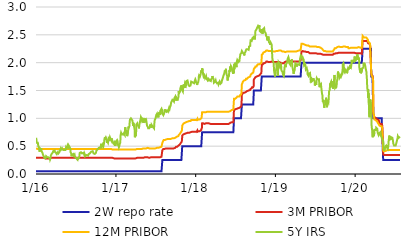
| Category | 2W repo rate | 3M PRIBOR | 12M PRIBOR | 5Y IRS |
|---|---|---|---|---|
| 2016-01-04 | 0.05 | 0.29 | 0.46 | 0.65 |
| 2016-01-05 | 0.05 | 0.29 | 0.46 | 0.63 |
| 2016-01-06 | 0.05 | 0.29 | 0.46 | 0.62 |
| 2016-01-07 | 0.05 | 0.29 | 0.46 | 0.56 |
| 2016-01-08 | 0.05 | 0.29 | 0.46 | 0.57 |
| 2016-01-11 | 0.05 | 0.29 | 0.45 | 0.56 |
| 2016-01-12 | 0.05 | 0.29 | 0.45 | 0.56 |
| 2016-01-13 | 0.05 | 0.29 | 0.45 | 0.56 |
| 2016-01-14 | 0.05 | 0.29 | 0.45 | 0.5 |
| 2016-01-15 | 0.05 | 0.29 | 0.45 | 0.49 |
| 2016-01-18 | 0.05 | 0.29 | 0.45 | 0.46 |
| 2016-01-19 | 0.05 | 0.29 | 0.45 | 0.46 |
| 2016-01-20 | 0.05 | 0.29 | 0.45 | 0.4 |
| 2016-01-21 | 0.05 | 0.29 | 0.45 | 0.43 |
| 2016-01-22 | 0.05 | 0.29 | 0.45 | 0.46 |
| 2016-01-25 | 0.05 | 0.29 | 0.45 | 0.45 |
| 2016-01-26 | 0.05 | 0.29 | 0.45 | 0.44 |
| 2016-01-27 | 0.05 | 0.29 | 0.45 | 0.46 |
| 2016-01-28 | 0.05 | 0.29 | 0.45 | 0.44 |
| 2016-01-29 | 0.05 | 0.29 | 0.45 | 0.41 |
| 2016-02-01 | 0.05 | 0.29 | 0.45 | 0.4 |
| 2016-02-02 | 0.05 | 0.29 | 0.45 | 0.38 |
| 2016-02-03 | 0.05 | 0.29 | 0.45 | 0.37 |
| 2016-02-04 | 0.05 | 0.29 | 0.45 | 0.37 |
| 2016-02-05 | 0.05 | 0.29 | 0.45 | 0.34 |
| 2016-02-08 | 0.05 | 0.29 | 0.45 | 0.32 |
| 2016-02-09 | 0.05 | 0.28 | 0.45 | 0.31 |
| 2016-02-10 | 0.05 | 0.28 | 0.45 | 0.31 |
| 2016-02-11 | 0.05 | 0.28 | 0.45 | 0.29 |
| 2016-02-12 | 0.05 | 0.28 | 0.45 | 0.28 |
| 2016-02-15 | 0.05 | 0.28 | 0.45 | 0.28 |
| 2016-02-16 | 0.05 | 0.28 | 0.45 | 0.28 |
| 2016-02-17 | 0.05 | 0.28 | 0.45 | 0.28 |
| 2016-02-18 | 0.05 | 0.28 | 0.45 | 0.3 |
| 2016-02-19 | 0.05 | 0.28 | 0.45 | 0.32 |
| 2016-02-22 | 0.05 | 0.28 | 0.45 | 0.32 |
| 2016-02-23 | 0.05 | 0.28 | 0.45 | 0.32 |
| 2016-02-24 | 0.05 | 0.28 | 0.45 | 0.3 |
| 2016-02-25 | 0.05 | 0.28 | 0.45 | 0.3 |
| 2016-02-26 | 0.05 | 0.28 | 0.45 | 0.31 |
| 2016-02-29 | 0.05 | 0.28 | 0.45 | 0.3 |
| 2016-03-01 | 0.05 | 0.28 | 0.45 | 0.29 |
| 2016-03-02 | 0.05 | 0.28 | 0.45 | 0.31 |
| 2016-03-03 | 0.05 | 0.28 | 0.45 | 0.3 |
| 2016-03-04 | 0.05 | 0.28 | 0.45 | 0.29 |
| 2016-03-07 | 0.05 | 0.28 | 0.45 | 0.28 |
| 2016-03-08 | 0.05 | 0.28 | 0.45 | 0.26 |
| 2016-03-09 | 0.05 | 0.28 | 0.45 | 0.26 |
| 2016-03-10 | 0.05 | 0.28 | 0.45 | 0.28 |
| 2016-03-11 | 0.05 | 0.29 | 0.45 | 0.33 |
| 2016-03-14 | 0.05 | 0.29 | 0.45 | 0.34 |
| 2016-03-15 | 0.05 | 0.29 | 0.45 | 0.36 |
| 2016-03-16 | 0.05 | 0.29 | 0.45 | 0.37 |
| 2016-03-17 | 0.05 | 0.29 | 0.45 | 0.37 |
| 2016-03-18 | 0.05 | 0.29 | 0.45 | 0.37 |
| 2016-03-21 | 0.05 | 0.29 | 0.45 | 0.39 |
| 2016-03-22 | 0.05 | 0.29 | 0.45 | 0.41 |
| 2016-03-23 | 0.05 | 0.29 | 0.45 | 0.41 |
| 2016-03-24 | 0.05 | 0.29 | 0.45 | 0.4 |
| 2016-03-29 | 0.05 | 0.29 | 0.45 | 0.42 |
| 2016-03-30 | 0.05 | 0.29 | 0.45 | 0.4 |
| 2016-03-31 | 0.05 | 0.29 | 0.45 | 0.4 |
| 2016-04-01 | 0.05 | 0.29 | 0.45 | 0.4 |
| 2016-04-04 | 0.05 | 0.29 | 0.45 | 0.38 |
| 2016-04-05 | 0.05 | 0.29 | 0.45 | 0.37 |
| 2016-04-06 | 0.05 | 0.29 | 0.45 | 0.38 |
| 2016-04-07 | 0.05 | 0.29 | 0.45 | 0.36 |
| 2016-04-08 | 0.05 | 0.29 | 0.45 | 0.36 |
| 2016-04-11 | 0.05 | 0.29 | 0.45 | 0.35 |
| 2016-04-12 | 0.05 | 0.29 | 0.45 | 0.39 |
| 2016-04-13 | 0.05 | 0.29 | 0.45 | 0.37 |
| 2016-04-14 | 0.05 | 0.29 | 0.45 | 0.39 |
| 2016-04-15 | 0.05 | 0.29 | 0.45 | 0.37 |
| 2016-04-18 | 0.05 | 0.29 | 0.45 | 0.37 |
| 2016-04-19 | 0.05 | 0.29 | 0.45 | 0.39 |
| 2016-04-20 | 0.05 | 0.29 | 0.45 | 0.38 |
| 2016-04-21 | 0.05 | 0.29 | 0.45 | 0.41 |
| 2016-04-22 | 0.05 | 0.29 | 0.45 | 0.41 |
| 2016-04-25 | 0.05 | 0.29 | 0.45 | 0.42 |
| 2016-04-26 | 0.05 | 0.29 | 0.45 | 0.46 |
| 2016-04-27 | 0.05 | 0.29 | 0.45 | 0.46 |
| 2016-04-28 | 0.05 | 0.29 | 0.45 | 0.44 |
| 2016-04-29 | 0.05 | 0.29 | 0.45 | 0.45 |
| 2016-05-02 | 0.05 | 0.29 | 0.45 | 0.46 |
| 2016-05-03 | 0.05 | 0.29 | 0.45 | 0.46 |
| 2016-05-04 | 0.05 | 0.29 | 0.45 | 0.44 |
| 2016-05-05 | 0.05 | 0.29 | 0.45 | 0.45 |
| 2016-05-06 | 0.05 | 0.29 | 0.45 | 0.44 |
| 2016-05-09 | 0.05 | 0.29 | 0.45 | 0.43 |
| 2016-05-10 | 0.05 | 0.29 | 0.45 | 0.44 |
| 2016-05-11 | 0.05 | 0.29 | 0.45 | 0.43 |
| 2016-05-12 | 0.05 | 0.29 | 0.45 | 0.42 |
| 2016-05-13 | 0.05 | 0.29 | 0.45 | 0.43 |
| 2016-05-16 | 0.05 | 0.29 | 0.45 | 0.43 |
| 2016-05-17 | 0.05 | 0.29 | 0.45 | 0.44 |
| 2016-05-18 | 0.05 | 0.29 | 0.45 | 0.44 |
| 2016-05-19 | 0.05 | 0.29 | 0.45 | 0.46 |
| 2016-05-20 | 0.05 | 0.29 | 0.45 | 0.48 |
| 2016-05-23 | 0.05 | 0.29 | 0.45 | 0.46 |
| 2016-05-24 | 0.05 | 0.29 | 0.45 | 0.46 |
| 2016-05-25 | 0.05 | 0.29 | 0.45 | 0.48 |
| 2016-05-26 | 0.05 | 0.29 | 0.45 | 0.48 |
| 2016-05-27 | 0.05 | 0.29 | 0.45 | 0.51 |
| 2016-05-30 | 0.05 | 0.29 | 0.45 | 0.49 |
| 2016-05-31 | 0.05 | 0.29 | 0.45 | 0.52 |
| 2016-06-01 | 0.05 | 0.29 | 0.45 | 0.51 |
| 2016-06-02 | 0.05 | 0.29 | 0.45 | 0.51 |
| 2016-06-03 | 0.05 | 0.29 | 0.45 | 0.51 |
| 2016-06-06 | 0.05 | 0.29 | 0.45 | 0.48 |
| 2016-06-07 | 0.05 | 0.29 | 0.45 | 0.49 |
| 2016-06-08 | 0.05 | 0.29 | 0.45 | 0.47 |
| 2016-06-09 | 0.05 | 0.29 | 0.45 | 0.45 |
| 2016-06-10 | 0.05 | 0.29 | 0.45 | 0.39 |
| 2016-06-13 | 0.05 | 0.29 | 0.45 | 0.37 |
| 2016-06-14 | 0.05 | 0.29 | 0.45 | 0.32 |
| 2016-06-15 | 0.05 | 0.29 | 0.45 | 0.32 |
| 2016-06-16 | 0.05 | 0.29 | 0.45 | 0.32 |
| 2016-06-17 | 0.05 | 0.29 | 0.45 | 0.35 |
| 2016-06-20 | 0.05 | 0.29 | 0.45 | 0.35 |
| 2016-06-21 | 0.05 | 0.29 | 0.45 | 0.36 |
| 2016-06-22 | 0.05 | 0.29 | 0.45 | 0.36 |
| 2016-06-23 | 0.05 | 0.29 | 0.45 | 0.36 |
| 2016-06-24 | 0.05 | 0.29 | 0.45 | 0.33 |
| 2016-06-27 | 0.05 | 0.29 | 0.45 | 0.32 |
| 2016-06-28 | 0.05 | 0.29 | 0.45 | 0.35 |
| 2016-06-29 | 0.05 | 0.29 | 0.45 | 0.33 |
| 2016-06-30 | 0.05 | 0.29 | 0.45 | 0.31 |
| 2016-07-01 | 0.05 | 0.29 | 0.45 | 0.31 |
| 2016-07-04 | 0.05 | 0.29 | 0.45 | 0.29 |
| 2016-07-07 | 0.05 | 0.29 | 0.45 | 0.28 |
| 2016-07-08 | 0.05 | 0.29 | 0.45 | 0.28 |
| 2016-07-11 | 0.05 | 0.29 | 0.45 | 0.26 |
| 2016-07-12 | 0.05 | 0.29 | 0.45 | 0.3 |
| 2016-07-13 | 0.05 | 0.29 | 0.45 | 0.29 |
| 2016-07-14 | 0.05 | 0.29 | 0.45 | 0.27 |
| 2016-07-15 | 0.05 | 0.29 | 0.45 | 0.28 |
| 2016-07-18 | 0.05 | 0.29 | 0.45 | 0.29 |
| 2016-07-19 | 0.05 | 0.29 | 0.45 | 0.28 |
| 2016-07-20 | 0.05 | 0.29 | 0.45 | 0.32 |
| 2016-07-21 | 0.05 | 0.29 | 0.45 | 0.36 |
| 2016-07-22 | 0.05 | 0.29 | 0.45 | 0.38 |
| 2016-07-25 | 0.05 | 0.29 | 0.45 | 0.38 |
| 2016-07-26 | 0.05 | 0.29 | 0.45 | 0.38 |
| 2016-07-27 | 0.05 | 0.29 | 0.45 | 0.39 |
| 2016-07-28 | 0.05 | 0.29 | 0.45 | 0.38 |
| 2016-07-29 | 0.05 | 0.29 | 0.45 | 0.38 |
| 2016-08-01 | 0.05 | 0.29 | 0.45 | 0.37 |
| 2016-08-02 | 0.05 | 0.29 | 0.45 | 0.37 |
| 2016-08-03 | 0.05 | 0.29 | 0.45 | 0.37 |
| 2016-08-04 | 0.05 | 0.29 | 0.45 | 0.38 |
| 2016-08-05 | 0.05 | 0.29 | 0.45 | 0.38 |
| 2016-08-08 | 0.05 | 0.29 | 0.45 | 0.38 |
| 2016-08-09 | 0.05 | 0.29 | 0.45 | 0.37 |
| 2016-08-10 | 0.05 | 0.29 | 0.45 | 0.37 |
| 2016-08-11 | 0.05 | 0.29 | 0.45 | 0.35 |
| 2016-08-12 | 0.05 | 0.29 | 0.45 | 0.37 |
| 2016-08-15 | 0.05 | 0.29 | 0.45 | 0.34 |
| 2016-08-16 | 0.05 | 0.29 | 0.45 | 0.32 |
| 2016-08-17 | 0.05 | 0.29 | 0.45 | 0.33 |
| 2016-08-18 | 0.05 | 0.29 | 0.45 | 0.33 |
| 2016-08-19 | 0.05 | 0.29 | 0.45 | 0.33 |
| 2016-08-22 | 0.05 | 0.29 | 0.45 | 0.34 |
| 2016-08-23 | 0.05 | 0.29 | 0.45 | 0.33 |
| 2016-08-24 | 0.05 | 0.29 | 0.45 | 0.33 |
| 2016-08-25 | 0.05 | 0.29 | 0.45 | 0.33 |
| 2016-08-26 | 0.05 | 0.29 | 0.45 | 0.33 |
| 2016-08-29 | 0.05 | 0.29 | 0.45 | 0.33 |
| 2016-08-30 | 0.05 | 0.29 | 0.45 | 0.33 |
| 2016-08-31 | 0.05 | 0.29 | 0.45 | 0.34 |
| 2016-09-01 | 0.05 | 0.29 | 0.45 | 0.36 |
| 2016-09-02 | 0.05 | 0.29 | 0.45 | 0.36 |
| 2016-09-05 | 0.05 | 0.29 | 0.45 | 0.37 |
| 2016-09-06 | 0.05 | 0.29 | 0.45 | 0.37 |
| 2016-09-07 | 0.05 | 0.29 | 0.45 | 0.36 |
| 2016-09-08 | 0.05 | 0.29 | 0.45 | 0.36 |
| 2016-09-09 | 0.05 | 0.29 | 0.45 | 0.38 |
| 2016-09-12 | 0.05 | 0.29 | 0.45 | 0.4 |
| 2016-09-13 | 0.05 | 0.29 | 0.45 | 0.4 |
| 2016-09-14 | 0.05 | 0.29 | 0.45 | 0.4 |
| 2016-09-15 | 0.05 | 0.29 | 0.45 | 0.41 |
| 2016-09-16 | 0.05 | 0.29 | 0.45 | 0.41 |
| 2016-09-19 | 0.05 | 0.29 | 0.45 | 0.41 |
| 2016-09-20 | 0.05 | 0.29 | 0.45 | 0.41 |
| 2016-09-21 | 0.05 | 0.29 | 0.45 | 0.39 |
| 2016-09-22 | 0.05 | 0.29 | 0.45 | 0.38 |
| 2016-09-23 | 0.05 | 0.29 | 0.45 | 0.37 |
| 2016-09-26 | 0.05 | 0.29 | 0.45 | 0.36 |
| 2016-09-27 | 0.05 | 0.29 | 0.45 | 0.36 |
| 2016-09-29 | 0.05 | 0.29 | 0.45 | 0.36 |
| 2016-09-30 | 0.05 | 0.29 | 0.45 | 0.36 |
| 2016-10-03 | 0.05 | 0.29 | 0.45 | 0.37 |
| 2016-10-04 | 0.05 | 0.29 | 0.45 | 0.38 |
| 2016-10-05 | 0.05 | 0.29 | 0.45 | 0.39 |
| 2016-10-06 | 0.05 | 0.29 | 0.45 | 0.42 |
| 2016-10-07 | 0.05 | 0.29 | 0.45 | 0.42 |
| 2016-10-10 | 0.05 | 0.29 | 0.45 | 0.43 |
| 2016-10-11 | 0.05 | 0.29 | 0.45 | 0.44 |
| 2016-10-12 | 0.05 | 0.29 | 0.45 | 0.44 |
| 2016-10-13 | 0.05 | 0.29 | 0.45 | 0.45 |
| 2016-10-14 | 0.05 | 0.29 | 0.45 | 0.45 |
| 2016-10-17 | 0.05 | 0.29 | 0.45 | 0.47 |
| 2016-10-18 | 0.05 | 0.29 | 0.45 | 0.47 |
| 2016-10-19 | 0.05 | 0.29 | 0.45 | 0.47 |
| 2016-10-20 | 0.05 | 0.29 | 0.45 | 0.48 |
| 2016-10-21 | 0.05 | 0.29 | 0.45 | 0.48 |
| 2016-10-24 | 0.05 | 0.29 | 0.45 | 0.48 |
| 2016-10-25 | 0.05 | 0.29 | 0.45 | 0.46 |
| 2016-10-26 | 0.05 | 0.29 | 0.45 | 0.48 |
| 2016-10-27 | 0.05 | 0.29 | 0.45 | 0.53 |
| 2016-10-31 | 0.05 | 0.29 | 0.45 | 0.54 |
| 2016-11-01 | 0.05 | 0.29 | 0.45 | 0.53 |
| 2016-11-02 | 0.05 | 0.29 | 0.45 | 0.51 |
| 2016-11-03 | 0.05 | 0.29 | 0.45 | 0.52 |
| 2016-11-04 | 0.05 | 0.29 | 0.45 | 0.53 |
| 2016-11-07 | 0.05 | 0.29 | 0.45 | 0.5 |
| 2016-11-08 | 0.05 | 0.29 | 0.45 | 0.49 |
| 2016-11-09 | 0.05 | 0.29 | 0.45 | 0.51 |
| 2016-11-10 | 0.05 | 0.29 | 0.45 | 0.55 |
| 2016-11-11 | 0.05 | 0.29 | 0.45 | 0.61 |
| 2016-11-14 | 0.05 | 0.29 | 0.45 | 0.66 |
| 2016-11-15 | 0.05 | 0.29 | 0.45 | 0.64 |
| 2016-11-16 | 0.05 | 0.29 | 0.45 | 0.65 |
| 2016-11-18 | 0.05 | 0.29 | 0.45 | 0.66 |
| 2016-11-21 | 0.05 | 0.29 | 0.45 | 0.63 |
| 2016-11-22 | 0.05 | 0.29 | 0.45 | 0.6 |
| 2016-11-23 | 0.05 | 0.29 | 0.45 | 0.56 |
| 2016-11-24 | 0.05 | 0.29 | 0.45 | 0.59 |
| 2016-11-25 | 0.05 | 0.29 | 0.45 | 0.59 |
| 2016-11-28 | 0.05 | 0.29 | 0.45 | 0.56 |
| 2016-11-29 | 0.05 | 0.29 | 0.45 | 0.56 |
| 2016-11-30 | 0.05 | 0.29 | 0.45 | 0.57 |
| 2016-12-01 | 0.05 | 0.29 | 0.45 | 0.64 |
| 2016-12-02 | 0.05 | 0.29 | 0.45 | 0.63 |
| 2016-12-05 | 0.05 | 0.29 | 0.45 | 0.62 |
| 2016-12-06 | 0.05 | 0.29 | 0.45 | 0.64 |
| 2016-12-07 | 0.05 | 0.29 | 0.45 | 0.66 |
| 2016-12-08 | 0.05 | 0.29 | 0.45 | 0.66 |
| 2016-12-09 | 0.05 | 0.29 | 0.45 | 0.64 |
| 2016-12-12 | 0.05 | 0.29 | 0.45 | 0.65 |
| 2016-12-13 | 0.05 | 0.29 | 0.45 | 0.63 |
| 2016-12-14 | 0.05 | 0.29 | 0.45 | 0.6 |
| 2016-12-15 | 0.05 | 0.29 | 0.45 | 0.64 |
| 2016-12-16 | 0.05 | 0.29 | 0.45 | 0.62 |
| 2016-12-19 | 0.05 | 0.29 | 0.44 | 0.59 |
| 2016-12-20 | 0.05 | 0.29 | 0.44 | 0.57 |
| 2016-12-21 | 0.05 | 0.29 | 0.44 | 0.56 |
| 2016-12-22 | 0.05 | 0.28 | 0.44 | 0.57 |
| 2016-12-23 | 0.05 | 0.28 | 0.44 | 0.55 |
| 2016-12-27 | 0.05 | 0.28 | 0.44 | 0.57 |
| 2016-12-28 | 0.05 | 0.27 | 0.43 | 0.54 |
| 2016-12-29 | 0.05 | 0.28 | 0.44 | 0.52 |
| 2016-12-30 | 0.05 | 0.28 | 0.44 | 0.52 |
| 2017-01-02 | 0.05 | 0.28 | 0.44 | 0.52 |
| 2017-01-03 | 0.05 | 0.28 | 0.44 | 0.52 |
| 2017-01-04 | 0.05 | 0.28 | 0.44 | 0.57 |
| 2017-01-05 | 0.05 | 0.28 | 0.44 | 0.59 |
| 2017-01-06 | 0.05 | 0.28 | 0.44 | 0.58 |
| 2017-01-09 | 0.05 | 0.28 | 0.44 | 0.61 |
| 2017-01-10 | 0.05 | 0.28 | 0.44 | 0.6 |
| 2017-01-11 | 0.05 | 0.28 | 0.44 | 0.59 |
| 2017-01-12 | 0.05 | 0.28 | 0.44 | 0.56 |
| 2017-01-13 | 0.05 | 0.28 | 0.44 | 0.52 |
| 2017-01-16 | 0.05 | 0.28 | 0.44 | 0.5 |
| 2017-01-17 | 0.05 | 0.28 | 0.44 | 0.48 |
| 2017-01-18 | 0.05 | 0.28 | 0.44 | 0.48 |
| 2017-01-19 | 0.05 | 0.28 | 0.44 | 0.5 |
| 2017-01-20 | 0.05 | 0.28 | 0.44 | 0.53 |
| 2017-01-23 | 0.05 | 0.28 | 0.44 | 0.56 |
| 2017-01-24 | 0.05 | 0.28 | 0.44 | 0.62 |
| 2017-01-25 | 0.05 | 0.28 | 0.44 | 0.7 |
| 2017-01-26 | 0.05 | 0.28 | 0.44 | 0.7 |
| 2017-01-27 | 0.05 | 0.28 | 0.44 | 0.74 |
| 2017-01-30 | 0.05 | 0.28 | 0.44 | 0.71 |
| 2017-01-31 | 0.05 | 0.28 | 0.44 | 0.71 |
| 2017-02-01 | 0.05 | 0.28 | 0.44 | 0.7 |
| 2017-02-02 | 0.05 | 0.28 | 0.44 | 0.72 |
| 2017-02-03 | 0.05 | 0.28 | 0.44 | 0.71 |
| 2017-02-06 | 0.05 | 0.28 | 0.44 | 0.71 |
| 2017-02-07 | 0.05 | 0.28 | 0.44 | 0.74 |
| 2017-02-08 | 0.05 | 0.28 | 0.44 | 0.75 |
| 2017-02-09 | 0.05 | 0.28 | 0.44 | 0.7 |
| 2017-02-10 | 0.05 | 0.28 | 0.44 | 0.72 |
| 2017-02-13 | 0.05 | 0.28 | 0.44 | 0.7 |
| 2017-02-14 | 0.05 | 0.28 | 0.44 | 0.77 |
| 2017-02-15 | 0.05 | 0.28 | 0.44 | 0.84 |
| 2017-02-16 | 0.05 | 0.28 | 0.44 | 0.83 |
| 2017-02-17 | 0.05 | 0.28 | 0.44 | 0.76 |
| 2017-02-20 | 0.05 | 0.28 | 0.44 | 0.79 |
| 2017-02-21 | 0.05 | 0.28 | 0.44 | 0.8 |
| 2017-02-22 | 0.05 | 0.28 | 0.44 | 0.78 |
| 2017-02-23 | 0.05 | 0.28 | 0.44 | 0.7 |
| 2017-02-24 | 0.05 | 0.28 | 0.44 | 0.68 |
| 2017-02-27 | 0.05 | 0.28 | 0.44 | 0.68 |
| 2017-02-28 | 0.05 | 0.28 | 0.44 | 0.77 |
| 2017-03-01 | 0.05 | 0.28 | 0.44 | 0.77 |
| 2017-03-02 | 0.05 | 0.28 | 0.44 | 0.85 |
| 2017-03-03 | 0.05 | 0.28 | 0.44 | 0.83 |
| 2017-03-06 | 0.05 | 0.28 | 0.44 | 0.86 |
| 2017-03-07 | 0.05 | 0.28 | 0.44 | 0.87 |
| 2017-03-08 | 0.05 | 0.28 | 0.44 | 0.96 |
| 2017-03-09 | 0.05 | 0.28 | 0.44 | 0.98 |
| 2017-03-10 | 0.05 | 0.28 | 0.44 | 0.99 |
| 2017-03-13 | 0.05 | 0.28 | 0.44 | 1 |
| 2017-03-14 | 0.05 | 0.28 | 0.44 | 1 |
| 2017-03-15 | 0.05 | 0.28 | 0.44 | 0.99 |
| 2017-03-16 | 0.05 | 0.28 | 0.44 | 0.99 |
| 2017-03-17 | 0.05 | 0.28 | 0.44 | 0.99 |
| 2017-03-20 | 0.05 | 0.28 | 0.44 | 0.96 |
| 2017-03-21 | 0.05 | 0.28 | 0.44 | 0.97 |
| 2017-03-22 | 0.05 | 0.28 | 0.44 | 0.9 |
| 2017-03-23 | 0.05 | 0.28 | 0.44 | 0.87 |
| 2017-03-24 | 0.05 | 0.28 | 0.44 | 0.92 |
| 2017-03-27 | 0.05 | 0.28 | 0.44 | 0.86 |
| 2017-03-28 | 0.05 | 0.28 | 0.44 | 0.84 |
| 2017-03-29 | 0.05 | 0.28 | 0.44 | 0.84 |
| 2017-03-30 | 0.05 | 0.28 | 0.44 | 0.8 |
| 2017-03-31 | 0.05 | 0.28 | 0.44 | 0.66 |
| 2017-04-03 | 0.05 | 0.28 | 0.44 | 0.71 |
| 2017-04-04 | 0.05 | 0.28 | 0.44 | 0.68 |
| 2017-04-05 | 0.05 | 0.28 | 0.44 | 0.73 |
| 2017-04-06 | 0.05 | 0.28 | 0.44 | 0.76 |
| 2017-04-07 | 0.05 | 0.29 | 0.44 | 0.89 |
| 2017-04-10 | 0.05 | 0.29 | 0.45 | 0.89 |
| 2017-04-11 | 0.05 | 0.29 | 0.45 | 0.91 |
| 2017-04-12 | 0.05 | 0.29 | 0.45 | 0.89 |
| 2017-04-13 | 0.05 | 0.29 | 0.45 | 0.88 |
| 2017-04-18 | 0.05 | 0.29 | 0.45 | 0.85 |
| 2017-04-19 | 0.05 | 0.29 | 0.45 | 0.82 |
| 2017-04-20 | 0.05 | 0.29 | 0.45 | 0.87 |
| 2017-04-21 | 0.05 | 0.29 | 0.45 | 0.88 |
| 2017-04-24 | 0.05 | 0.29 | 0.45 | 0.95 |
| 2017-04-25 | 0.05 | 0.29 | 0.45 | 0.93 |
| 2017-04-26 | 0.05 | 0.29 | 0.45 | 0.94 |
| 2017-04-27 | 0.05 | 0.29 | 0.45 | 0.99 |
| 2017-04-28 | 0.05 | 0.29 | 0.45 | 1.02 |
| 2017-05-02 | 0.05 | 0.29 | 0.45 | 1.02 |
| 2017-05-03 | 0.05 | 0.29 | 0.45 | 0.98 |
| 2017-05-04 | 0.05 | 0.29 | 0.45 | 1.01 |
| 2017-05-05 | 0.05 | 0.29 | 0.45 | 0.95 |
| 2017-05-09 | 0.05 | 0.29 | 0.46 | 0.97 |
| 2017-05-10 | 0.05 | 0.29 | 0.46 | 0.92 |
| 2017-05-11 | 0.05 | 0.3 | 0.46 | 0.94 |
| 2017-05-12 | 0.05 | 0.3 | 0.46 | 0.96 |
| 2017-05-15 | 0.05 | 0.3 | 0.46 | 0.96 |
| 2017-05-16 | 0.05 | 0.3 | 0.46 | 1 |
| 2017-05-17 | 0.05 | 0.3 | 0.46 | 0.97 |
| 2017-05-18 | 0.05 | 0.3 | 0.46 | 0.95 |
| 2017-05-19 | 0.05 | 0.3 | 0.46 | 0.96 |
| 2017-05-22 | 0.05 | 0.3 | 0.46 | 0.97 |
| 2017-05-23 | 0.05 | 0.3 | 0.46 | 0.94 |
| 2017-05-24 | 0.05 | 0.3 | 0.47 | 0.92 |
| 2017-05-25 | 0.05 | 0.3 | 0.47 | 0.89 |
| 2017-05-26 | 0.05 | 0.3 | 0.47 | 0.87 |
| 2017-05-29 | 0.05 | 0.3 | 0.47 | 0.87 |
| 2017-05-30 | 0.05 | 0.3 | 0.46 | 0.84 |
| 2017-05-31 | 0.05 | 0.3 | 0.46 | 0.82 |
| 2017-06-01 | 0.05 | 0.3 | 0.46 | 0.81 |
| 2017-06-02 | 0.05 | 0.29 | 0.46 | 0.81 |
| 2017-06-05 | 0.05 | 0.29 | 0.46 | 0.82 |
| 2017-06-06 | 0.05 | 0.29 | 0.46 | 0.82 |
| 2017-06-07 | 0.05 | 0.29 | 0.46 | 0.81 |
| 2017-06-08 | 0.05 | 0.29 | 0.46 | 0.85 |
| 2017-06-09 | 0.05 | 0.3 | 0.46 | 0.89 |
| 2017-06-12 | 0.05 | 0.3 | 0.46 | 0.86 |
| 2017-06-13 | 0.05 | 0.3 | 0.46 | 0.87 |
| 2017-06-14 | 0.05 | 0.3 | 0.46 | 0.87 |
| 2017-06-15 | 0.05 | 0.3 | 0.46 | 0.83 |
| 2017-06-16 | 0.05 | 0.3 | 0.46 | 0.88 |
| 2017-06-19 | 0.05 | 0.3 | 0.46 | 0.86 |
| 2017-06-20 | 0.05 | 0.3 | 0.46 | 0.86 |
| 2017-06-21 | 0.05 | 0.3 | 0.46 | 0.86 |
| 2017-06-22 | 0.05 | 0.3 | 0.46 | 0.86 |
| 2017-06-23 | 0.05 | 0.3 | 0.46 | 0.84 |
| 2017-06-26 | 0.05 | 0.3 | 0.46 | 0.83 |
| 2017-06-27 | 0.05 | 0.3 | 0.46 | 0.82 |
| 2017-06-28 | 0.05 | 0.3 | 0.46 | 0.89 |
| 2017-06-29 | 0.05 | 0.29 | 0.46 | 0.94 |
| 2017-06-30 | 0.05 | 0.3 | 0.46 | 0.97 |
| 2017-07-03 | 0.05 | 0.3 | 0.46 | 0.99 |
| 2017-07-04 | 0.05 | 0.3 | 0.46 | 0.98 |
| 2017-07-07 | 0.05 | 0.3 | 0.47 | 1.06 |
| 2017-07-10 | 0.05 | 0.3 | 0.47 | 1.08 |
| 2017-07-11 | 0.05 | 0.3 | 0.47 | 1.05 |
| 2017-07-12 | 0.05 | 0.3 | 0.47 | 1.05 |
| 2017-07-13 | 0.05 | 0.3 | 0.47 | 1.03 |
| 2017-07-14 | 0.05 | 0.3 | 0.47 | 1.03 |
| 2017-07-17 | 0.05 | 0.3 | 0.47 | 1.03 |
| 2017-07-18 | 0.05 | 0.3 | 0.47 | 1.03 |
| 2017-07-19 | 0.05 | 0.3 | 0.47 | 1.09 |
| 2017-07-20 | 0.05 | 0.3 | 0.48 | 1.1 |
| 2017-07-21 | 0.05 | 0.3 | 0.48 | 1.08 |
| 2017-07-24 | 0.05 | 0.3 | 0.48 | 1.08 |
| 2017-07-25 | 0.05 | 0.3 | 0.48 | 1.13 |
| 2017-07-26 | 0.05 | 0.3 | 0.48 | 1.14 |
| 2017-07-27 | 0.05 | 0.3 | 0.48 | 1.14 |
| 2017-07-28 | 0.05 | 0.31 | 0.48 | 1.15 |
| 2017-07-31 | 0.05 | 0.31 | 0.49 | 1.17 |
| 2017-08-01 | 0.05 | 0.31 | 0.49 | 1.18 |
| 2017-08-02 | 0.05 | 0.31 | 0.49 | 1.14 |
| 2017-08-03 | 0.05 | 0.31 | 0.49 | 1.16 |
| 2017-08-04 | 0.25 | 0.43 | 0.56 | 1.08 |
| 2017-08-07 | 0.25 | 0.44 | 0.59 | 1.07 |
| 2017-08-08 | 0.25 | 0.44 | 0.6 | 1.06 |
| 2017-08-09 | 0.25 | 0.45 | 0.6 | 1.09 |
| 2017-08-10 | 0.25 | 0.45 | 0.61 | 1.07 |
| 2017-08-11 | 0.25 | 0.45 | 0.61 | 1.09 |
| 2017-08-14 | 0.25 | 0.45 | 0.61 | 1.11 |
| 2017-08-15 | 0.25 | 0.45 | 0.61 | 1.11 |
| 2017-08-16 | 0.25 | 0.45 | 0.62 | 1.16 |
| 2017-08-17 | 0.25 | 0.46 | 0.62 | 1.14 |
| 2017-08-18 | 0.25 | 0.46 | 0.62 | 1.14 |
| 2017-08-21 | 0.25 | 0.46 | 0.62 | 1.14 |
| 2017-08-22 | 0.25 | 0.46 | 0.63 | 1.12 |
| 2017-08-23 | 0.25 | 0.46 | 0.63 | 1.13 |
| 2017-08-24 | 0.25 | 0.46 | 0.63 | 1.13 |
| 2017-08-25 | 0.25 | 0.46 | 0.63 | 1.14 |
| 2017-08-28 | 0.25 | 0.46 | 0.63 | 1.14 |
| 2017-08-29 | 0.25 | 0.46 | 0.63 | 1.14 |
| 2017-08-30 | 0.25 | 0.46 | 0.63 | 1.12 |
| 2017-08-31 | 0.25 | 0.46 | 0.63 | 1.14 |
| 2017-09-01 | 0.25 | 0.46 | 0.63 | 1.15 |
| 2017-09-04 | 0.25 | 0.46 | 0.63 | 1.19 |
| 2017-09-05 | 0.25 | 0.46 | 0.63 | 1.19 |
| 2017-09-06 | 0.25 | 0.46 | 0.63 | 1.17 |
| 2017-09-07 | 0.25 | 0.46 | 0.63 | 1.19 |
| 2017-09-08 | 0.25 | 0.46 | 0.63 | 1.2 |
| 2017-09-11 | 0.25 | 0.46 | 0.63 | 1.23 |
| 2017-09-12 | 0.25 | 0.46 | 0.64 | 1.24 |
| 2017-09-13 | 0.25 | 0.46 | 0.64 | 1.28 |
| 2017-09-14 | 0.25 | 0.46 | 0.64 | 1.28 |
| 2017-09-15 | 0.25 | 0.46 | 0.64 | 1.3 |
| 2017-09-18 | 0.25 | 0.46 | 0.64 | 1.3 |
| 2017-09-19 | 0.25 | 0.46 | 0.64 | 1.33 |
| 2017-09-20 | 0.25 | 0.46 | 0.64 | 1.32 |
| 2017-09-21 | 0.25 | 0.46 | 0.64 | 1.35 |
| 2017-09-22 | 0.25 | 0.46 | 0.64 | 1.32 |
| 2017-09-25 | 0.25 | 0.46 | 0.64 | 1.31 |
| 2017-09-26 | 0.25 | 0.46 | 0.64 | 1.3 |
| 2017-09-27 | 0.25 | 0.47 | 0.64 | 1.33 |
| 2017-09-29 | 0.25 | 0.47 | 0.65 | 1.37 |
| 2017-10-02 | 0.25 | 0.47 | 0.65 | 1.39 |
| 2017-10-03 | 0.25 | 0.47 | 0.65 | 1.39 |
| 2017-10-04 | 0.25 | 0.47 | 0.65 | 1.36 |
| 2017-10-05 | 0.25 | 0.48 | 0.66 | 1.32 |
| 2017-10-06 | 0.25 | 0.49 | 0.66 | 1.38 |
| 2017-10-09 | 0.25 | 0.49 | 0.67 | 1.36 |
| 2017-10-10 | 0.25 | 0.49 | 0.67 | 1.35 |
| 2017-10-11 | 0.25 | 0.49 | 0.66 | 1.37 |
| 2017-10-12 | 0.25 | 0.49 | 0.66 | 1.32 |
| 2017-10-13 | 0.25 | 0.5 | 0.67 | 1.35 |
| 2017-10-16 | 0.25 | 0.51 | 0.68 | 1.37 |
| 2017-10-17 | 0.25 | 0.51 | 0.69 | 1.4 |
| 2017-10-18 | 0.25 | 0.52 | 0.7 | 1.49 |
| 2017-10-19 | 0.25 | 0.52 | 0.71 | 1.45 |
| 2017-10-20 | 0.25 | 0.52 | 0.71 | 1.46 |
| 2017-10-23 | 0.25 | 0.53 | 0.72 | 1.47 |
| 2017-10-24 | 0.25 | 0.54 | 0.72 | 1.47 |
| 2017-10-25 | 0.25 | 0.54 | 0.73 | 1.53 |
| 2017-10-26 | 0.25 | 0.55 | 0.74 | 1.55 |
| 2017-10-27 | 0.25 | 0.56 | 0.74 | 1.56 |
| 2017-10-30 | 0.25 | 0.57 | 0.75 | 1.59 |
| 2017-10-31 | 0.25 | 0.58 | 0.77 | 1.52 |
| 2017-11-01 | 0.25 | 0.59 | 0.77 | 1.53 |
| 2017-11-02 | 0.25 | 0.61 | 0.79 | 1.59 |
| 2017-11-03 | 0.5 | 0.69 | 0.87 | 1.5 |
| 2017-11-06 | 0.5 | 0.7 | 0.89 | 1.48 |
| 2017-11-07 | 0.5 | 0.7 | 0.89 | 1.53 |
| 2017-11-08 | 0.5 | 0.71 | 0.89 | 1.52 |
| 2017-11-09 | 0.5 | 0.72 | 0.9 | 1.57 |
| 2017-11-10 | 0.5 | 0.72 | 0.91 | 1.61 |
| 2017-11-13 | 0.5 | 0.72 | 0.91 | 1.56 |
| 2017-11-14 | 0.5 | 0.72 | 0.92 | 1.59 |
| 2017-11-15 | 0.5 | 0.72 | 0.92 | 1.55 |
| 2017-11-16 | 0.5 | 0.72 | 0.93 | 1.63 |
| 2017-11-20 | 0.5 | 0.73 | 0.93 | 1.6 |
| 2017-11-21 | 0.5 | 0.73 | 0.94 | 1.65 |
| 2017-11-22 | 0.5 | 0.73 | 0.94 | 1.67 |
| 2017-11-23 | 0.5 | 0.73 | 0.94 | 1.68 |
| 2017-11-24 | 0.5 | 0.74 | 0.94 | 1.68 |
| 2017-11-27 | 0.5 | 0.74 | 0.94 | 1.68 |
| 2017-11-28 | 0.5 | 0.74 | 0.94 | 1.68 |
| 2017-11-29 | 0.5 | 0.74 | 0.95 | 1.65 |
| 2017-11-30 | 0.5 | 0.74 | 0.95 | 1.66 |
| 2017-12-01 | 0.5 | 0.74 | 0.94 | 1.6 |
| 2017-12-04 | 0.5 | 0.74 | 0.95 | 1.6 |
| 2017-12-05 | 0.5 | 0.74 | 0.95 | 1.59 |
| 2017-12-06 | 0.5 | 0.74 | 0.95 | 1.58 |
| 2017-12-07 | 0.5 | 0.74 | 0.95 | 1.57 |
| 2017-12-08 | 0.5 | 0.75 | 0.95 | 1.57 |
| 2017-12-11 | 0.5 | 0.75 | 0.95 | 1.59 |
| 2017-12-12 | 0.5 | 0.75 | 0.95 | 1.59 |
| 2017-12-13 | 0.5 | 0.75 | 0.96 | 1.64 |
| 2017-12-14 | 0.5 | 0.76 | 0.97 | 1.66 |
| 2017-12-15 | 0.5 | 0.76 | 0.97 | 1.66 |
| 2017-12-18 | 0.5 | 0.76 | 0.97 | 1.66 |
| 2017-12-19 | 0.5 | 0.76 | 0.97 | 1.65 |
| 2017-12-20 | 0.5 | 0.76 | 0.97 | 1.66 |
| 2017-12-21 | 0.5 | 0.76 | 0.97 | 1.66 |
| 2017-12-22 | 0.5 | 0.76 | 0.97 | 1.66 |
| 2017-12-27 | 0.5 | 0.76 | 0.97 | 1.63 |
| 2017-12-28 | 0.5 | 0.76 | 0.97 | 1.64 |
| 2017-12-29 | 0.5 | 0.76 | 0.97 | 1.64 |
| 2018-01-02 | 0.5 | 0.76 | 0.97 | 1.7 |
| 2018-01-03 | 0.5 | 0.76 | 0.97 | 1.69 |
| 2018-01-04 | 0.5 | 0.76 | 0.97 | 1.68 |
| 2018-01-05 | 0.5 | 0.76 | 0.97 | 1.65 |
| 2018-01-08 | 0.5 | 0.76 | 0.97 | 1.63 |
| 2018-01-09 | 0.5 | 0.76 | 0.97 | 1.63 |
| 2018-01-10 | 0.5 | 0.76 | 0.97 | 1.6 |
| 2018-01-11 | 0.5 | 0.78 | 0.99 | 1.59 |
| 2018-01-12 | 0.5 | 0.76 | 0.97 | 1.63 |
| 2018-01-15 | 0.5 | 0.76 | 0.97 | 1.65 |
| 2018-01-16 | 0.5 | 0.76 | 0.97 | 1.66 |
| 2018-01-17 | 0.5 | 0.77 | 0.98 | 1.69 |
| 2018-01-18 | 0.5 | 0.77 | 0.98 | 1.75 |
| 2018-01-19 | 0.5 | 0.77 | 0.98 | 1.77 |
| 2018-01-22 | 0.5 | 0.77 | 0.98 | 1.77 |
| 2018-01-23 | 0.5 | 0.77 | 0.98 | 1.75 |
| 2018-01-24 | 0.5 | 0.77 | 0.98 | 1.75 |
| 2018-01-25 | 0.5 | 0.78 | 0.99 | 1.75 |
| 2018-01-26 | 0.5 | 0.78 | 0.99 | 1.79 |
| 2018-01-29 | 0.5 | 0.79 | 1 | 1.86 |
| 2018-01-30 | 0.5 | 0.81 | 1.01 | 1.84 |
| 2018-01-31 | 0.5 | 0.81 | 1.02 | 1.82 |
| 2018-02-01 | 0.5 | 0.83 | 1.03 | 1.86 |
| 2018-02-02 | 0.75 | 0.91 | 1.11 | 1.9 |
| 2018-02-05 | 0.75 | 0.91 | 1.11 | 1.86 |
| 2018-02-06 | 0.75 | 0.91 | 1.11 | 1.8 |
| 2018-02-07 | 0.75 | 0.91 | 1.11 | 1.79 |
| 2018-02-08 | 0.75 | 0.91 | 1.11 | 1.81 |
| 2018-02-09 | 0.75 | 0.9 | 1.11 | 1.75 |
| 2018-02-12 | 0.75 | 0.9 | 1.11 | 1.77 |
| 2018-02-13 | 0.75 | 0.9 | 1.11 | 1.75 |
| 2018-02-14 | 0.75 | 0.9 | 1.11 | 1.72 |
| 2018-02-15 | 0.75 | 0.9 | 1.11 | 1.76 |
| 2018-02-16 | 0.75 | 0.9 | 1.11 | 1.73 |
| 2018-02-19 | 0.75 | 0.91 | 1.11 | 1.72 |
| 2018-02-20 | 0.75 | 0.91 | 1.11 | 1.76 |
| 2018-02-21 | 0.75 | 0.91 | 1.11 | 1.73 |
| 2018-02-22 | 0.75 | 0.91 | 1.12 | 1.71 |
| 2018-02-23 | 0.75 | 0.91 | 1.12 | 1.71 |
| 2018-02-26 | 0.75 | 0.91 | 1.12 | 1.69 |
| 2018-02-27 | 0.75 | 0.91 | 1.12 | 1.71 |
| 2018-02-28 | 0.75 | 0.91 | 1.12 | 1.73 |
| 2018-03-01 | 0.75 | 0.91 | 1.12 | 1.7 |
| 2018-03-02 | 0.75 | 0.91 | 1.12 | 1.68 |
| 2018-03-05 | 0.75 | 0.91 | 1.12 | 1.67 |
| 2018-03-06 | 0.75 | 0.91 | 1.12 | 1.69 |
| 2018-03-07 | 0.75 | 0.91 | 1.12 | 1.69 |
| 2018-03-08 | 0.75 | 0.91 | 1.12 | 1.71 |
| 2018-03-09 | 0.75 | 0.9 | 1.12 | 1.68 |
| 2018-03-12 | 0.75 | 0.9 | 1.12 | 1.67 |
| 2018-03-13 | 0.75 | 0.9 | 1.12 | 1.67 |
| 2018-03-14 | 0.75 | 0.9 | 1.12 | 1.67 |
| 2018-03-15 | 0.75 | 0.9 | 1.12 | 1.7 |
| 2018-03-16 | 0.75 | 0.9 | 1.12 | 1.7 |
| 2018-03-19 | 0.75 | 0.9 | 1.12 | 1.71 |
| 2018-03-20 | 0.75 | 0.9 | 1.12 | 1.72 |
| 2018-03-21 | 0.75 | 0.9 | 1.12 | 1.76 |
| 2018-03-22 | 0.75 | 0.9 | 1.12 | 1.75 |
| 2018-03-23 | 0.75 | 0.9 | 1.12 | 1.73 |
| 2018-03-26 | 0.75 | 0.9 | 1.12 | 1.71 |
| 2018-03-27 | 0.75 | 0.9 | 1.12 | 1.69 |
| 2018-03-28 | 0.75 | 0.9 | 1.12 | 1.64 |
| 2018-03-29 | 0.75 | 0.9 | 1.12 | 1.65 |
| 2018-04-03 | 0.75 | 0.9 | 1.12 | 1.66 |
| 2018-04-04 | 0.75 | 0.9 | 1.12 | 1.66 |
| 2018-04-05 | 0.75 | 0.9 | 1.12 | 1.68 |
| 2018-04-06 | 0.75 | 0.9 | 1.12 | 1.66 |
| 2018-04-09 | 0.75 | 0.9 | 1.12 | 1.65 |
| 2018-04-10 | 0.75 | 0.9 | 1.12 | 1.65 |
| 2018-04-11 | 0.75 | 0.9 | 1.12 | 1.63 |
| 2018-04-12 | 0.75 | 0.9 | 1.12 | 1.62 |
| 2018-04-13 | 0.75 | 0.9 | 1.12 | 1.64 |
| 2018-04-16 | 0.75 | 0.9 | 1.12 | 1.64 |
| 2018-04-17 | 0.75 | 0.9 | 1.13 | 1.63 |
| 2018-04-18 | 0.75 | 0.9 | 1.12 | 1.61 |
| 2018-04-19 | 0.75 | 0.9 | 1.12 | 1.62 |
| 2018-04-20 | 0.75 | 0.9 | 1.12 | 1.63 |
| 2018-04-23 | 0.75 | 0.9 | 1.12 | 1.66 |
| 2018-04-24 | 0.75 | 0.9 | 1.12 | 1.65 |
| 2018-04-25 | 0.75 | 0.9 | 1.12 | 1.66 |
| 2018-04-26 | 0.75 | 0.9 | 1.12 | 1.66 |
| 2018-04-27 | 0.75 | 0.9 | 1.12 | 1.62 |
| 2018-04-30 | 0.75 | 0.9 | 1.12 | 1.62 |
| 2018-05-02 | 0.75 | 0.9 | 1.12 | 1.64 |
| 2018-05-03 | 0.75 | 0.9 | 1.12 | 1.67 |
| 2018-05-04 | 0.75 | 0.9 | 1.12 | 1.68 |
| 2018-05-07 | 0.75 | 0.9 | 1.12 | 1.68 |
| 2018-05-09 | 0.75 | 0.9 | 1.12 | 1.74 |
| 2018-05-10 | 0.75 | 0.9 | 1.12 | 1.76 |
| 2018-05-11 | 0.75 | 0.9 | 1.12 | 1.76 |
| 2018-05-14 | 0.75 | 0.9 | 1.12 | 1.8 |
| 2018-05-15 | 0.75 | 0.9 | 1.12 | 1.82 |
| 2018-05-16 | 0.75 | 0.9 | 1.12 | 1.84 |
| 2018-05-17 | 0.75 | 0.9 | 1.12 | 1.86 |
| 2018-05-18 | 0.75 | 0.9 | 1.12 | 1.84 |
| 2018-05-21 | 0.75 | 0.9 | 1.12 | 1.87 |
| 2018-05-22 | 0.75 | 0.9 | 1.12 | 1.89 |
| 2018-05-23 | 0.75 | 0.9 | 1.12 | 1.85 |
| 2018-05-24 | 0.75 | 0.9 | 1.12 | 1.82 |
| 2018-05-25 | 0.75 | 0.9 | 1.12 | 1.79 |
| 2018-05-28 | 0.75 | 0.9 | 1.12 | 1.76 |
| 2018-05-29 | 0.75 | 0.9 | 1.12 | 1.7 |
| 2018-05-30 | 0.75 | 0.9 | 1.12 | 1.68 |
| 2018-05-31 | 0.75 | 0.9 | 1.12 | 1.73 |
| 2018-06-01 | 0.75 | 0.9 | 1.12 | 1.72 |
| 2018-06-04 | 0.75 | 0.9 | 1.12 | 1.73 |
| 2018-06-05 | 0.75 | 0.9 | 1.12 | 1.76 |
| 2018-06-06 | 0.75 | 0.9 | 1.12 | 1.83 |
| 2018-06-07 | 0.75 | 0.9 | 1.12 | 1.86 |
| 2018-06-08 | 0.75 | 0.9 | 1.12 | 1.84 |
| 2018-06-11 | 0.75 | 0.92 | 1.13 | 1.93 |
| 2018-06-12 | 0.75 | 0.92 | 1.14 | 1.93 |
| 2018-06-13 | 0.75 | 0.92 | 1.14 | 1.91 |
| 2018-06-14 | 0.75 | 0.93 | 1.14 | 1.94 |
| 2018-06-15 | 0.75 | 0.92 | 1.14 | 1.94 |
| 2018-06-18 | 0.75 | 0.93 | 1.15 | 1.91 |
| 2018-06-19 | 0.75 | 0.93 | 1.15 | 1.87 |
| 2018-06-20 | 0.75 | 0.93 | 1.15 | 1.85 |
| 2018-06-21 | 0.75 | 0.93 | 1.15 | 1.85 |
| 2018-06-22 | 0.75 | 0.93 | 1.16 | 1.85 |
| 2018-06-25 | 0.75 | 0.93 | 1.16 | 1.8 |
| 2018-06-26 | 0.75 | 0.93 | 1.16 | 1.84 |
| 2018-06-27 | 0.75 | 0.93 | 1.16 | 1.82 |
| 2018-06-28 | 1 | 1.16 | 1.35 | 1.94 |
| 2018-06-29 | 1 | 1.16 | 1.35 | 1.94 |
| 2018-07-02 | 1 | 1.16 | 1.35 | 1.92 |
| 2018-07-03 | 1 | 1.16 | 1.35 | 1.97 |
| 2018-07-04 | 1 | 1.17 | 1.36 | 2 |
| 2018-07-09 | 1 | 1.17 | 1.37 | 1.92 |
| 2018-07-10 | 1 | 1.17 | 1.37 | 1.94 |
| 2018-07-11 | 1 | 1.18 | 1.38 | 2.02 |
| 2018-07-12 | 1 | 1.18 | 1.38 | 2.02 |
| 2018-07-13 | 1 | 1.18 | 1.39 | 2.05 |
| 2018-07-16 | 1 | 1.18 | 1.39 | 2.03 |
| 2018-07-17 | 1 | 1.19 | 1.4 | 2.03 |
| 2018-07-18 | 1 | 1.18 | 1.39 | 2.01 |
| 2018-07-19 | 1 | 1.19 | 1.39 | 2.02 |
| 2018-07-20 | 1 | 1.18 | 1.39 | 2.01 |
| 2018-07-23 | 1 | 1.19 | 1.39 | 2.03 |
| 2018-07-24 | 1 | 1.19 | 1.4 | 2.08 |
| 2018-07-25 | 1 | 1.2 | 1.41 | 2.09 |
| 2018-07-26 | 1 | 1.2 | 1.41 | 2.12 |
| 2018-07-27 | 1 | 1.2 | 1.41 | 2.15 |
| 2018-07-30 | 1 | 1.21 | 1.43 | 2.15 |
| 2018-07-31 | 1 | 1.22 | 1.43 | 2.17 |
| 2018-08-01 | 1 | 1.23 | 1.45 | 2.18 |
| 2018-08-02 | 1 | 1.24 | 1.45 | 2.17 |
| 2018-08-03 | 1.25 | 1.42 | 1.61 | 2.21 |
| 2018-08-06 | 1.25 | 1.44 | 1.64 | 2.19 |
| 2018-08-07 | 1.25 | 1.45 | 1.65 | 2.19 |
| 2018-08-08 | 1.25 | 1.45 | 1.66 | 2.19 |
| 2018-08-09 | 1.25 | 1.46 | 1.67 | 2.17 |
| 2018-08-10 | 1.25 | 1.46 | 1.67 | 2.18 |
| 2018-08-13 | 1.25 | 1.46 | 1.68 | 2.15 |
| 2018-08-14 | 1.25 | 1.46 | 1.68 | 2.13 |
| 2018-08-15 | 1.25 | 1.46 | 1.68 | 2.16 |
| 2018-08-16 | 1.25 | 1.46 | 1.68 | 2.17 |
| 2018-08-17 | 1.25 | 1.47 | 1.68 | 2.18 |
| 2018-08-20 | 1.25 | 1.47 | 1.69 | 2.2 |
| 2018-08-21 | 1.25 | 1.48 | 1.7 | 2.22 |
| 2018-08-22 | 1.25 | 1.48 | 1.71 | 2.22 |
| 2018-08-23 | 1.25 | 1.48 | 1.71 | 2.23 |
| 2018-08-24 | 1.25 | 1.48 | 1.71 | 2.24 |
| 2018-08-27 | 1.25 | 1.49 | 1.71 | 2.24 |
| 2018-08-28 | 1.25 | 1.49 | 1.72 | 2.24 |
| 2018-08-29 | 1.25 | 1.49 | 1.72 | 2.24 |
| 2018-08-30 | 1.25 | 1.49 | 1.73 | 2.24 |
| 2018-08-31 | 1.25 | 1.5 | 1.73 | 2.23 |
| 2018-09-03 | 1.25 | 1.5 | 1.73 | 2.23 |
| 2018-09-04 | 1.25 | 1.5 | 1.74 | 2.25 |
| 2018-09-05 | 1.25 | 1.51 | 1.74 | 2.29 |
| 2018-09-06 | 1.25 | 1.51 | 1.75 | 2.3 |
| 2018-09-07 | 1.25 | 1.51 | 1.74 | 2.3 |
| 2018-09-10 | 1.25 | 1.51 | 1.75 | 2.3 |
| 2018-09-11 | 1.25 | 1.52 | 1.77 | 2.37 |
| 2018-09-12 | 1.25 | 1.53 | 1.78 | 2.4 |
| 2018-09-13 | 1.25 | 1.54 | 1.78 | 2.39 |
| 2018-09-14 | 1.25 | 1.54 | 1.79 | 2.39 |
| 2018-09-17 | 1.25 | 1.54 | 1.79 | 2.39 |
| 2018-09-18 | 1.25 | 1.55 | 1.8 | 2.39 |
| 2018-09-19 | 1.25 | 1.56 | 1.81 | 2.42 |
| 2018-09-20 | 1.25 | 1.56 | 1.81 | 2.44 |
| 2018-09-21 | 1.25 | 1.56 | 1.82 | 2.43 |
| 2018-09-24 | 1.25 | 1.56 | 1.82 | 2.43 |
| 2018-09-25 | 1.25 | 1.57 | 1.82 | 2.46 |
| 2018-09-26 | 1.25 | 1.58 | 1.83 | 2.46 |
| 2018-09-27 | 1.5 | 1.7 | 1.89 | 2.43 |
| 2018-10-01 | 1.5 | 1.72 | 1.9 | 2.43 |
| 2018-10-02 | 1.5 | 1.73 | 1.91 | 2.43 |
| 2018-10-03 | 1.5 | 1.73 | 1.92 | 2.5 |
| 2018-10-04 | 1.5 | 1.74 | 1.93 | 2.57 |
| 2018-10-05 | 1.5 | 1.74 | 1.93 | 2.56 |
| 2018-10-08 | 1.5 | 1.74 | 1.93 | 2.56 |
| 2018-10-09 | 1.5 | 1.75 | 1.93 | 2.6 |
| 2018-10-10 | 1.5 | 1.75 | 1.94 | 2.61 |
| 2018-10-11 | 1.5 | 1.75 | 1.95 | 2.61 |
| 2018-10-12 | 1.5 | 1.75 | 1.96 | 2.63 |
| 2018-10-15 | 1.5 | 1.76 | 1.96 | 2.64 |
| 2018-10-16 | 1.5 | 1.76 | 1.97 | 2.66 |
| 2018-10-17 | 1.5 | 1.76 | 1.97 | 2.65 |
| 2018-10-18 | 1.5 | 1.76 | 1.97 | 2.66 |
| 2018-10-19 | 1.5 | 1.77 | 1.97 | 2.64 |
| 2018-10-22 | 1.5 | 1.77 | 1.97 | 2.67 |
| 2018-10-23 | 1.5 | 1.77 | 1.98 | 2.64 |
| 2018-10-24 | 1.5 | 1.78 | 1.98 | 2.57 |
| 2018-10-25 | 1.5 | 1.78 | 1.97 | 2.56 |
| 2018-10-26 | 1.5 | 1.79 | 1.98 | 2.56 |
| 2018-10-29 | 1.5 | 1.8 | 1.99 | 2.55 |
| 2018-10-30 | 1.5 | 1.8 | 1.99 | 2.56 |
| 2018-10-31 | 1.5 | 1.81 | 2 | 2.58 |
| 2018-11-01 | 1.5 | 1.82 | 2.01 | 2.6 |
| 2018-11-02 | 1.75 | 1.96 | 2.14 | 2.58 |
| 2018-11-05 | 1.75 | 1.97 | 2.14 | 2.57 |
| 2018-11-06 | 1.75 | 1.97 | 2.15 | 2.52 |
| 2018-11-07 | 1.75 | 1.97 | 2.16 | 2.56 |
| 2018-11-08 | 1.75 | 1.98 | 2.17 | 2.6 |
| 2018-11-09 | 1.75 | 1.99 | 2.18 | 2.6 |
| 2018-11-12 | 1.75 | 1.99 | 2.18 | 2.6 |
| 2018-11-13 | 1.75 | 1.99 | 2.18 | 2.62 |
| 2018-11-14 | 1.75 | 1.99 | 2.19 | 2.58 |
| 2018-11-15 | 1.75 | 2 | 2.2 | 2.56 |
| 2018-11-16 | 1.75 | 2 | 2.2 | 2.56 |
| 2018-11-19 | 1.75 | 2 | 2.2 | 2.55 |
| 2018-11-20 | 1.75 | 2.01 | 2.21 | 2.53 |
| 2018-11-21 | 1.75 | 2.01 | 2.21 | 2.51 |
| 2018-11-22 | 1.75 | 2.01 | 2.21 | 2.48 |
| 2018-11-23 | 1.75 | 2.02 | 2.22 | 2.49 |
| 2018-11-26 | 1.75 | 2.02 | 2.22 | 2.46 |
| 2018-11-27 | 1.75 | 2.02 | 2.22 | 2.4 |
| 2018-11-28 | 1.75 | 2.02 | 2.22 | 2.4 |
| 2018-11-29 | 1.75 | 2.02 | 2.22 | 2.42 |
| 2018-11-30 | 1.75 | 2.02 | 2.22 | 2.41 |
| 2018-12-03 | 1.75 | 2.01 | 2.21 | 2.47 |
| 2018-12-04 | 1.75 | 2.01 | 2.21 | 2.4 |
| 2018-12-05 | 1.75 | 2.01 | 2.21 | 2.37 |
| 2018-12-06 | 1.75 | 2.01 | 2.21 | 2.37 |
| 2018-12-07 | 1.75 | 2.01 | 2.21 | 2.36 |
| 2018-12-10 | 1.75 | 2.01 | 2.21 | 2.34 |
| 2018-12-11 | 1.75 | 2.01 | 2.21 | 2.32 |
| 2018-12-12 | 1.75 | 2.01 | 2.21 | 2.34 |
| 2018-12-13 | 1.75 | 2.02 | 2.21 | 2.36 |
| 2018-12-14 | 1.75 | 2.02 | 2.21 | 2.35 |
| 2018-12-17 | 1.75 | 2.02 | 2.21 | 2.33 |
| 2018-12-18 | 1.75 | 2.02 | 2.21 | 2.3 |
| 2018-12-19 | 1.75 | 2.02 | 2.21 | 2.29 |
| 2018-12-20 | 1.75 | 2.02 | 2.21 | 2.11 |
| 2018-12-21 | 1.75 | 2.02 | 2.21 | 2.06 |
| 2018-12-27 | 1.75 | 2.01 | 2.2 | 1.99 |
| 2018-12-28 | 1.75 | 2.02 | 2.21 | 1.86 |
| 2018-12-31 | 1.75 | 2.01 | 2.21 | 1.85 |
| 2019-01-02 | 1.75 | 2.01 | 2.2 | 1.75 |
| 2019-01-03 | 1.75 | 2.01 | 2.2 | 1.74 |
| 2019-01-04 | 1.75 | 2.01 | 2.21 | 1.83 |
| 2019-01-07 | 1.75 | 2.01 | 2.21 | 1.88 |
| 2019-01-08 | 1.75 | 2.01 | 2.21 | 1.9 |
| 2019-01-09 | 1.75 | 2.01 | 2.21 | 2 |
| 2019-01-10 | 1.75 | 2.01 | 2.21 | 1.97 |
| 2019-01-11 | 1.75 | 2.01 | 2.21 | 1.94 |
| 2019-01-14 | 1.75 | 2.01 | 2.21 | 1.88 |
| 2019-01-15 | 1.75 | 2.01 | 2.21 | 1.77 |
| 2019-01-16 | 1.75 | 2.01 | 2.21 | 1.88 |
| 2019-01-17 | 1.75 | 2.01 | 2.21 | 1.94 |
| 2019-01-18 | 1.75 | 2.01 | 2.22 | 2.01 |
| 2019-01-21 | 1.75 | 2.01 | 2.22 | 1.99 |
| 2019-01-22 | 1.75 | 2.01 | 2.22 | 1.99 |
| 2019-01-23 | 1.75 | 2.01 | 2.22 | 1.96 |
| 2019-01-24 | 1.75 | 2 | 2.22 | 1.97 |
| 2019-01-25 | 1.75 | 2 | 2.22 | 1.93 |
| 2019-01-28 | 1.75 | 2 | 2.22 | 1.93 |
| 2019-01-29 | 1.75 | 1.99 | 2.22 | 1.96 |
| 2019-01-30 | 1.75 | 1.99 | 2.21 | 1.93 |
| 2019-01-31 | 1.75 | 1.99 | 2.21 | 1.86 |
| 2019-02-01 | 1.75 | 1.99 | 2.21 | 1.86 |
| 2019-02-04 | 1.75 | 1.99 | 2.2 | 1.84 |
| 2019-02-05 | 1.75 | 1.99 | 2.2 | 1.83 |
| 2019-02-06 | 1.75 | 1.99 | 2.2 | 1.82 |
| 2019-02-07 | 1.75 | 1.99 | 2.2 | 1.79 |
| 2019-02-08 | 1.75 | 1.99 | 2.2 | 1.78 |
| 2019-02-11 | 1.75 | 1.99 | 2.2 | 1.76 |
| 2019-02-12 | 1.75 | 1.99 | 2.2 | 1.78 |
| 2019-02-13 | 1.75 | 2 | 2.19 | 1.83 |
| 2019-02-14 | 1.75 | 2 | 2.19 | 1.9 |
| 2019-02-15 | 1.75 | 2.01 | 2.19 | 1.93 |
| 2019-02-18 | 1.75 | 2.02 | 2.19 | 1.97 |
| 2019-02-19 | 1.75 | 2.02 | 2.19 | 1.98 |
| 2019-02-20 | 1.75 | 2.02 | 2.19 | 1.92 |
| 2019-02-21 | 1.75 | 2.02 | 2.19 | 1.95 |
| 2019-02-22 | 1.75 | 2.02 | 2.19 | 1.98 |
| 2019-02-25 | 1.75 | 2.02 | 2.2 | 1.99 |
| 2019-02-26 | 1.75 | 2.02 | 2.2 | 2 |
| 2019-02-27 | 1.75 | 2.02 | 2.2 | 2.02 |
| 2019-02-28 | 1.75 | 2.02 | 2.2 | 2.06 |
| 2019-03-01 | 1.75 | 2.03 | 2.2 | 2.07 |
| 2019-03-04 | 1.75 | 2.03 | 2.2 | 2.1 |
| 2019-03-05 | 1.75 | 2.03 | 2.2 | 2.1 |
| 2019-03-06 | 1.75 | 2.03 | 2.2 | 2.07 |
| 2019-03-07 | 1.75 | 2.03 | 2.21 | 2.06 |
| 2019-03-08 | 1.75 | 2.03 | 2.2 | 1.99 |
| 2019-03-11 | 1.75 | 2.03 | 2.2 | 1.99 |
| 2019-03-12 | 1.75 | 2.03 | 2.2 | 1.99 |
| 2019-03-13 | 1.75 | 2.03 | 2.2 | 1.96 |
| 2019-03-14 | 1.75 | 2.03 | 2.2 | 1.98 |
| 2019-03-15 | 1.75 | 2.03 | 2.2 | 2.02 |
| 2019-03-18 | 1.75 | 2.03 | 2.2 | 2.04 |
| 2019-03-19 | 1.75 | 2.03 | 2.2 | 2.05 |
| 2019-03-20 | 1.75 | 2.03 | 2.2 | 2.06 |
| 2019-03-21 | 1.75 | 2.03 | 2.2 | 1.98 |
| 2019-03-22 | 1.75 | 2.03 | 2.2 | 1.93 |
| 2019-03-25 | 1.75 | 2.02 | 2.2 | 1.87 |
| 2019-03-26 | 1.75 | 2.02 | 2.2 | 1.87 |
| 2019-03-27 | 1.75 | 2.02 | 2.2 | 1.86 |
| 2019-03-28 | 1.75 | 2.02 | 2.2 | 1.8 |
| 2019-03-29 | 1.75 | 2.02 | 2.2 | 1.83 |
| 2019-04-01 | 1.75 | 2.02 | 2.2 | 1.84 |
| 2019-04-02 | 1.75 | 2.02 | 2.2 | 1.87 |
| 2019-04-03 | 1.75 | 2.02 | 2.2 | 1.93 |
| 2019-04-04 | 1.75 | 2.02 | 2.2 | 1.94 |
| 2019-04-05 | 1.75 | 2.02 | 2.2 | 1.99 |
| 2019-04-08 | 1.75 | 2.02 | 2.2 | 1.98 |
| 2019-04-09 | 1.75 | 2.02 | 2.2 | 1.97 |
| 2019-04-10 | 1.75 | 2.02 | 2.2 | 1.97 |
| 2019-04-11 | 1.75 | 2.02 | 2.2 | 1.93 |
| 2019-04-12 | 1.75 | 2.02 | 2.21 | 1.95 |
| 2019-04-15 | 1.75 | 2.02 | 2.21 | 1.97 |
| 2019-04-16 | 1.75 | 2.02 | 2.21 | 1.96 |
| 2019-04-17 | 1.75 | 2.02 | 2.21 | 1.98 |
| 2019-04-18 | 1.75 | 2.02 | 2.21 | 1.98 |
| 2019-04-23 | 1.75 | 2.02 | 2.22 | 1.96 |
| 2019-04-24 | 1.75 | 2.02 | 2.22 | 1.99 |
| 2019-04-25 | 1.75 | 2.02 | 2.22 | 2 |
| 2019-04-26 | 1.75 | 2.03 | 2.23 | 2.06 |
| 2019-04-29 | 1.75 | 2.04 | 2.23 | 2.06 |
| 2019-04-30 | 1.75 | 2.05 | 2.23 | 2.13 |
| 2019-05-02 | 1.75 | 2.05 | 2.23 | 2.13 |
| 2019-05-03 | 2 | 2.2 | 2.34 | 2.12 |
| 2019-05-06 | 2 | 2.21 | 2.34 | 2.09 |
| 2019-05-07 | 2 | 2.21 | 2.34 | 2.08 |
| 2019-05-09 | 2 | 2.21 | 2.34 | 2.06 |
| 2019-05-10 | 2 | 2.2 | 2.34 | 2.08 |
| 2019-05-13 | 2 | 2.2 | 2.33 | 2.05 |
| 2019-05-14 | 2 | 2.2 | 2.33 | 2.02 |
| 2019-05-15 | 2 | 2.2 | 2.32 | 1.95 |
| 2019-05-16 | 2 | 2.2 | 2.32 | 1.95 |
| 2019-05-17 | 2 | 2.2 | 2.32 | 1.96 |
| 2019-05-20 | 2 | 2.2 | 2.32 | 1.97 |
| 2019-05-21 | 2 | 2.2 | 2.32 | 1.96 |
| 2019-05-22 | 2 | 2.2 | 2.32 | 1.92 |
| 2019-05-23 | 2 | 2.19 | 2.31 | 1.88 |
| 2019-05-24 | 2 | 2.19 | 2.31 | 1.88 |
| 2019-05-27 | 2 | 2.19 | 2.31 | 1.9 |
| 2019-05-28 | 2 | 2.19 | 2.31 | 1.88 |
| 2019-05-29 | 2 | 2.19 | 2.31 | 1.87 |
| 2019-05-30 | 2 | 2.19 | 2.31 | 1.86 |
| 2019-05-31 | 2 | 2.19 | 2.31 | 1.79 |
| 2019-06-03 | 2 | 2.19 | 2.31 | 1.77 |
| 2019-06-04 | 2 | 2.18 | 2.3 | 1.78 |
| 2019-06-05 | 2 | 2.18 | 2.3 | 1.82 |
| 2019-06-06 | 2 | 2.18 | 2.3 | 1.79 |
| 2019-06-07 | 2 | 2.18 | 2.3 | 1.8 |
| 2019-06-10 | 2 | 2.17 | 2.29 | 1.79 |
| 2019-06-11 | 2 | 2.17 | 2.29 | 1.81 |
| 2019-06-12 | 2 | 2.17 | 2.29 | 1.77 |
| 2019-06-13 | 2 | 2.17 | 2.29 | 1.73 |
| 2019-06-14 | 2 | 2.17 | 2.29 | 1.68 |
| 2019-06-17 | 2 | 2.17 | 2.29 | 1.7 |
| 2019-06-18 | 2 | 2.17 | 2.29 | 1.66 |
| 2019-06-19 | 2 | 2.17 | 2.29 | 1.66 |
| 2019-06-20 | 2 | 2.17 | 2.29 | 1.65 |
| 2019-06-21 | 2 | 2.17 | 2.29 | 1.67 |
| 2019-06-24 | 2 | 2.17 | 2.29 | 1.68 |
| 2019-06-25 | 2 | 2.17 | 2.29 | 1.68 |
| 2019-06-26 | 2 | 2.17 | 2.29 | 1.69 |
| 2019-06-27 | 2 | 2.17 | 2.29 | 1.72 |
| 2019-06-28 | 2 | 2.17 | 2.29 | 1.69 |
| 2019-07-01 | 2 | 2.17 | 2.29 | 1.68 |
| 2019-07-02 | 2 | 2.17 | 2.29 | 1.67 |
| 2019-07-03 | 2 | 2.17 | 2.29 | 1.59 |
| 2019-07-04 | 2 | 2.17 | 2.29 | 1.59 |
| 2019-07-08 | 2 | 2.17 | 2.29 | 1.63 |
| 2019-07-09 | 2 | 2.17 | 2.28 | 1.6 |
| 2019-07-10 | 2 | 2.17 | 2.28 | 1.63 |
| 2019-07-11 | 2 | 2.17 | 2.28 | 1.62 |
| 2019-07-12 | 2 | 2.17 | 2.28 | 1.72 |
| 2019-07-15 | 2 | 2.16 | 2.28 | 1.7 |
| 2019-07-16 | 2 | 2.16 | 2.28 | 1.7 |
| 2019-07-17 | 2 | 2.16 | 2.28 | 1.7 |
| 2019-07-18 | 2 | 2.16 | 2.28 | 1.7 |
| 2019-07-19 | 2 | 2.16 | 2.28 | 1.7 |
| 2019-07-22 | 2 | 2.16 | 2.28 | 1.7 |
| 2019-07-23 | 2 | 2.16 | 2.28 | 1.69 |
| 2019-07-24 | 2 | 2.16 | 2.28 | 1.59 |
| 2019-07-25 | 2 | 2.16 | 2.28 | 1.56 |
| 2019-07-26 | 2 | 2.16 | 2.27 | 1.6 |
| 2019-07-29 | 2 | 2.16 | 2.27 | 1.6 |
| 2019-07-30 | 2 | 2.16 | 2.27 | 1.61 |
| 2019-07-31 | 2 | 2.16 | 2.27 | 1.62 |
| 2019-08-01 | 2 | 2.16 | 2.27 | 1.62 |
| 2019-08-02 | 2 | 2.16 | 2.26 | 1.54 |
| 2019-08-05 | 2 | 2.15 | 2.25 | 1.44 |
| 2019-08-06 | 2 | 2.15 | 2.25 | 1.44 |
| 2019-08-07 | 2 | 2.15 | 2.24 | 1.41 |
| 2019-08-08 | 2 | 2.14 | 2.24 | 1.32 |
| 2019-08-09 | 2 | 2.14 | 2.23 | 1.29 |
| 2019-08-12 | 2 | 2.14 | 2.23 | 1.33 |
| 2019-08-13 | 2 | 2.14 | 2.22 | 1.27 |
| 2019-08-14 | 2 | 2.14 | 2.21 | 1.23 |
| 2019-08-15 | 2 | 2.14 | 2.21 | 1.19 |
| 2019-08-16 | 2 | 2.14 | 2.2 | 1.21 |
| 2019-08-19 | 2 | 2.14 | 2.21 | 1.25 |
| 2019-08-20 | 2 | 2.14 | 2.21 | 1.25 |
| 2019-08-21 | 2 | 2.14 | 2.21 | 1.27 |
| 2019-08-22 | 2 | 2.14 | 2.2 | 1.3 |
| 2019-08-23 | 2 | 2.14 | 2.2 | 1.37 |
| 2019-08-26 | 2 | 2.14 | 2.2 | 1.32 |
| 2019-08-27 | 2 | 2.14 | 2.2 | 1.27 |
| 2019-08-28 | 2 | 2.14 | 2.2 | 1.2 |
| 2019-08-29 | 2 | 2.14 | 2.2 | 1.25 |
| 2019-08-30 | 2 | 2.14 | 2.2 | 1.3 |
| 2019-09-02 | 2 | 2.14 | 2.2 | 1.3 |
| 2019-09-03 | 2 | 2.14 | 2.2 | 1.28 |
| 2019-09-04 | 2 | 2.14 | 2.2 | 1.32 |
| 2019-09-05 | 2 | 2.14 | 2.2 | 1.39 |
| 2019-09-06 | 2 | 2.14 | 2.2 | 1.48 |
| 2019-09-09 | 2 | 2.14 | 2.2 | 1.51 |
| 2019-09-10 | 2 | 2.14 | 2.2 | 1.56 |
| 2019-09-11 | 2 | 2.14 | 2.2 | 1.62 |
| 2019-09-12 | 2 | 2.14 | 2.2 | 1.55 |
| 2019-09-13 | 2 | 2.14 | 2.2 | 1.63 |
| 2019-09-16 | 2 | 2.14 | 2.2 | 1.66 |
| 2019-09-17 | 2 | 2.14 | 2.2 | 1.67 |
| 2019-09-18 | 2 | 2.14 | 2.2 | 1.62 |
| 2019-09-19 | 2 | 2.14 | 2.2 | 1.6 |
| 2019-09-20 | 2 | 2.14 | 2.2 | 1.61 |
| 2019-09-23 | 2 | 2.14 | 2.2 | 1.58 |
| 2019-09-24 | 2 | 2.14 | 2.2 | 1.56 |
| 2019-09-25 | 2 | 2.14 | 2.2 | 1.53 |
| 2019-09-26 | 2 | 2.15 | 2.22 | 1.67 |
| 2019-09-27 | 2 | 2.16 | 2.23 | 1.65 |
| 2019-09-30 | 2 | 2.16 | 2.24 | 1.7 |
| 2019-10-01 | 2 | 2.16 | 2.25 | 1.78 |
| 2019-10-02 | 2 | 2.16 | 2.26 | 1.71 |
| 2019-10-03 | 2 | 2.17 | 2.26 | 1.59 |
| 2019-10-04 | 2 | 2.17 | 2.25 | 1.55 |
| 2019-10-07 | 2 | 2.17 | 2.26 | 1.57 |
| 2019-10-08 | 2 | 2.17 | 2.27 | 1.54 |
| 2019-10-09 | 2 | 2.17 | 2.27 | 1.55 |
| 2019-10-10 | 2 | 2.17 | 2.27 | 1.54 |
| 2019-10-11 | 2 | 2.17 | 2.27 | 1.64 |
| 2019-10-14 | 2 | 2.17 | 2.28 | 1.7 |
| 2019-10-15 | 2 | 2.17 | 2.28 | 1.72 |
| 2019-10-16 | 2 | 2.18 | 2.29 | 1.79 |
| 2019-10-17 | 2 | 2.18 | 2.29 | 1.84 |
| 2019-10-18 | 2 | 2.18 | 2.29 | 1.85 |
| 2019-10-21 | 2 | 2.18 | 2.29 | 1.78 |
| 2019-10-22 | 2 | 2.18 | 2.29 | 1.74 |
| 2019-10-23 | 2 | 2.18 | 2.29 | 1.76 |
| 2019-10-24 | 2 | 2.18 | 2.28 | 1.73 |
| 2019-10-25 | 2 | 2.18 | 2.28 | 1.74 |
| 2019-10-29 | 2 | 2.18 | 2.28 | 1.77 |
| 2019-10-30 | 2 | 2.18 | 2.28 | 1.78 |
| 2019-10-31 | 2 | 2.18 | 2.28 | 1.75 |
| 2019-11-01 | 2 | 2.17 | 2.27 | 1.74 |
| 2019-11-04 | 2 | 2.18 | 2.28 | 1.79 |
| 2019-11-05 | 2 | 2.18 | 2.28 | 1.82 |
| 2019-11-06 | 2 | 2.18 | 2.28 | 1.83 |
| 2019-11-07 | 2 | 2.18 | 2.28 | 1.85 |
| 2019-11-08 | 2 | 2.19 | 2.29 | 1.97 |
| 2019-11-11 | 2 | 2.18 | 2.29 | 1.99 |
| 2019-11-12 | 2 | 2.18 | 2.29 | 1.97 |
| 2019-11-13 | 2 | 2.18 | 2.29 | 1.92 |
| 2019-11-14 | 2 | 2.17 | 2.28 | 1.85 |
| 2019-11-15 | 2 | 2.17 | 2.28 | 1.83 |
| 2019-11-18 | 2 | 2.18 | 2.29 | 1.85 |
| 2019-11-19 | 2 | 2.18 | 2.29 | 1.87 |
| 2019-11-20 | 2 | 2.18 | 2.28 | 1.85 |
| 2019-11-21 | 2 | 2.18 | 2.28 | 1.86 |
| 2019-11-22 | 2 | 2.18 | 2.28 | 1.87 |
| 2019-11-25 | 2 | 2.18 | 2.28 | 1.87 |
| 2019-11-26 | 2 | 2.18 | 2.28 | 1.84 |
| 2019-11-27 | 2 | 2.18 | 2.28 | 1.81 |
| 2019-11-28 | 2 | 2.18 | 2.28 | 1.81 |
| 2019-11-29 | 2 | 2.18 | 2.28 | 1.83 |
| 2019-12-02 | 2 | 2.18 | 2.28 | 1.89 |
| 2019-12-03 | 2 | 2.18 | 2.27 | 1.88 |
| 2019-12-04 | 2 | 2.18 | 2.26 | 1.87 |
| 2019-12-05 | 2 | 2.18 | 2.26 | 1.9 |
| 2019-12-06 | 2 | 2.18 | 2.26 | 1.91 |
| 2019-12-09 | 2 | 2.18 | 2.26 | 1.91 |
| 2019-12-10 | 2 | 2.18 | 2.26 | 1.93 |
| 2019-12-11 | 2 | 2.18 | 2.26 | 1.89 |
| 2019-12-12 | 2 | 2.18 | 2.26 | 1.88 |
| 2019-12-13 | 2 | 2.18 | 2.27 | 1.96 |
| 2019-12-16 | 2 | 2.18 | 2.27 | 1.93 |
| 2019-12-17 | 2 | 2.18 | 2.27 | 1.95 |
| 2019-12-18 | 2 | 2.18 | 2.27 | 1.95 |
| 2019-12-19 | 2 | 2.18 | 2.27 | 2.05 |
| 2019-12-20 | 2 | 2.18 | 2.27 | 2.03 |
| 2019-12-23 | 2 | 2.18 | 2.27 | 2.01 |
| 2019-12-27 | 2 | 2.18 | 2.27 | 2.02 |
| 2019-12-30 | 2 | 2.18 | 2.27 | 2.05 |
| 2019-12-31 | 2 | 2.18 | 2.27 | 2.07 |
| 2020-01-02 | 2 | 2.18 | 2.27 | 2.11 |
| 2020-01-03 | 2 | 2.17 | 2.27 | 2.03 |
| 2020-01-06 | 2 | 2.17 | 2.27 | 2.02 |
| 2020-01-07 | 2 | 2.17 | 2.27 | 2.04 |
| 2020-01-08 | 2 | 2.17 | 2.27 | 2.05 |
| 2020-01-09 | 2 | 2.17 | 2.27 | 2.07 |
| 2020-01-10 | 2 | 2.17 | 2.27 | 2.06 |
| 2020-01-13 | 2 | 2.17 | 2.27 | 2.13 |
| 2020-01-14 | 2 | 2.17 | 2.28 | 2.15 |
| 2020-01-15 | 2 | 2.17 | 2.28 | 2.08 |
| 2020-01-16 | 2 | 2.17 | 2.28 | 2.11 |
| 2020-01-17 | 2 | 2.17 | 2.28 | 2.05 |
| 2020-01-20 | 2 | 2.17 | 2.28 | 2.09 |
| 2020-01-21 | 2 | 2.17 | 2.28 | 2.08 |
| 2020-01-22 | 2 | 2.17 | 2.28 | 2.04 |
| 2020-01-23 | 2 | 2.17 | 2.28 | 1.9 |
| 2020-01-24 | 2 | 2.17 | 2.28 | 1.88 |
| 2020-01-27 | 2 | 2.17 | 2.27 | 1.84 |
| 2020-01-28 | 2 | 2.17 | 2.27 | 1.82 |
| 2020-01-29 | 2 | 2.17 | 2.27 | 1.9 |
| 2020-01-30 | 2 | 2.16 | 2.27 | 1.81 |
| 2020-01-31 | 2 | 2.16 | 2.27 | 1.82 |
| 2020-02-03 | 2 | 2.16 | 2.27 | 1.8 |
| 2020-02-04 | 2 | 2.16 | 2.27 | 1.86 |
| 2020-02-05 | 2 | 2.16 | 2.27 | 1.9 |
| 2020-02-06 | 2 | 2.16 | 2.27 | 1.89 |
| 2020-02-07 | 2.25 | 2.39 | 2.48 | 1.91 |
| 2020-02-10 | 2.25 | 2.39 | 2.47 | 1.91 |
| 2020-02-11 | 2.25 | 2.39 | 2.46 | 1.95 |
| 2020-02-12 | 2.25 | 2.39 | 2.45 | 2 |
| 2020-02-13 | 2.25 | 2.39 | 2.45 | 1.96 |
| 2020-02-14 | 2.25 | 2.39 | 2.45 | 1.99 |
| 2020-02-17 | 2.25 | 2.39 | 2.45 | 2 |
| 2020-02-18 | 2.25 | 2.39 | 2.45 | 1.98 |
| 2020-02-19 | 2.25 | 2.39 | 2.45 | 1.94 |
| 2020-02-20 | 2.25 | 2.39 | 2.45 | 1.91 |
| 2020-02-21 | 2.25 | 2.39 | 2.45 | 1.89 |
| 2020-02-24 | 2.25 | 2.39 | 2.45 | 1.84 |
| 2020-02-25 | 2.25 | 2.39 | 2.45 | 1.78 |
| 2020-02-26 | 2.25 | 2.39 | 2.45 | 1.74 |
| 2020-02-27 | 2.25 | 2.39 | 2.45 | 1.75 |
| 2020-02-28 | 2.25 | 2.38 | 2.43 | 1.55 |
| 2020-03-02 | 2.25 | 2.37 | 2.41 | 1.47 |
| 2020-03-03 | 2.25 | 2.35 | 2.38 | 1.52 |
| 2020-03-04 | 2.25 | 2.34 | 2.37 | 1.37 |
| 2020-03-05 | 2.25 | 2.34 | 2.37 | 1.45 |
| 2020-03-06 | 2.25 | 2.34 | 2.37 | 1.28 |
| 2020-03-09 | 2.25 | 2.34 | 2.36 | 1.02 |
| 2020-03-10 | 2.25 | 2.34 | 2.36 | 1.14 |
| 2020-03-11 | 2.25 | 2.33 | 2.36 | 1.08 |
| 2020-03-12 | 2.25 | 2.32 | 2.34 | 1.17 |
| 2020-03-13 | 2.25 | 2.31 | 2.34 | 1.34 |
| 2020-03-16 | 2.25 | 2.31 | 2.33 | 1.24 |
| 2020-03-17 | 1.75 | 1.83 | 1.85 | 1.07 |
| 2020-03-18 | 1.75 | 1.8 | 1.8 | 1.01 |
| 2020-03-19 | 1.75 | 1.79 | 1.77 | 0.87 |
| 2020-03-20 | 1.75 | 1.78 | 1.77 | 0.83 |
| 2020-03-23 | 1.75 | 1.76 | 1.75 | 0.73 |
| 2020-03-24 | 1.75 | 1.74 | 1.72 | 0.66 |
| 2020-03-25 | 1.75 | 1.72 | 1.71 | 0.79 |
| 2020-03-26 | 1.75 | 1.71 | 1.68 | 0.79 |
| 2020-03-27 | 1 | 1.08 | 1.11 | 0.71 |
| 2020-03-30 | 1 | 1.04 | 1.04 | 0.68 |
| 2020-03-31 | 1 | 1.03 | 1 | 0.75 |
| 2020-04-01 | 1 | 1.02 | 0.98 | 0.74 |
| 2020-04-02 | 1 | 1.02 | 0.98 | 0.81 |
| 2020-04-03 | 1 | 1.01 | 0.97 | 0.79 |
| 2020-04-06 | 1 | 1.01 | 0.97 | 0.78 |
| 2020-04-07 | 1 | 1.01 | 0.97 | 0.78 |
| 2020-04-08 | 1 | 1 | 0.97 | 0.79 |
| 2020-04-09 | 1 | 1 | 0.97 | 0.83 |
| 2020-04-14 | 1 | 0.98 | 0.94 | 0.81 |
| 2020-04-15 | 1 | 0.98 | 0.93 | 0.76 |
| 2020-04-16 | 1 | 0.97 | 0.92 | 0.75 |
| 2020-04-17 | 1 | 0.97 | 0.91 | 0.73 |
| 2020-04-20 | 1 | 0.97 | 0.91 | 0.7 |
| 2020-04-21 | 1 | 0.96 | 0.89 | 0.7 |
| 2020-04-22 | 1 | 0.95 | 0.88 | 0.71 |
| 2020-04-23 | 1 | 0.93 | 0.88 | 0.73 |
| 2020-04-24 | 1 | 0.91 | 0.87 | 0.72 |
| 2020-04-27 | 1 | 0.9 | 0.87 | 0.72 |
| 2020-04-28 | 1 | 0.9 | 0.87 | 0.75 |
| 2020-04-29 | 1 | 0.9 | 0.86 | 0.73 |
| 2020-04-30 | 1 | 0.9 | 0.86 | 0.69 |
| 2020-05-04 | 1 | 0.9 | 0.86 | 0.66 |
| 2020-05-05 | 1 | 0.9 | 0.85 | 0.64 |
| 2020-05-06 | 1 | 0.89 | 0.83 | 0.64 |
| 2020-05-07 | 1 | 0.87 | 0.82 | 0.64 |
| 2020-05-11 | 0.25 | 0.35 | 0.43 | 0.59 |
| 2020-05-12 | 0.25 | 0.35 | 0.42 | 0.56 |
| 2020-05-13 | 0.25 | 0.35 | 0.41 | 0.48 |
| 2020-05-14 | 0.25 | 0.35 | 0.41 | 0.48 |
| 2020-05-15 | 0.25 | 0.34 | 0.41 | 0.42 |
| 2020-05-18 | 0.25 | 0.34 | 0.41 | 0.42 |
| 2020-05-19 | 0.25 | 0.34 | 0.41 | 0.46 |
| 2020-05-20 | 0.25 | 0.34 | 0.41 | 0.49 |
| 2020-05-21 | 0.25 | 0.34 | 0.41 | 0.49 |
| 2020-05-22 | 0.25 | 0.34 | 0.42 | 0.49 |
| 2020-05-25 | 0.25 | 0.34 | 0.42 | 0.51 |
| 2020-05-26 | 0.25 | 0.33 | 0.42 | 0.51 |
| 2020-05-27 | 0.25 | 0.34 | 0.42 | 0.51 |
| 2020-05-28 | 0.25 | 0.34 | 0.43 | 0.51 |
| 2020-05-29 | 0.25 | 0.34 | 0.43 | 0.47 |
| 2020-06-01 | 0.25 | 0.34 | 0.43 | 0.45 |
| 2020-06-02 | 0.25 | 0.34 | 0.43 | 0.47 |
| 2020-06-03 | 0.25 | 0.34 | 0.43 | 0.49 |
| 2020-06-04 | 0.25 | 0.34 | 0.43 | 0.53 |
| 2020-06-05 | 0.25 | 0.34 | 0.43 | 0.6 |
| 2020-06-08 | 0.25 | 0.34 | 0.43 | 0.69 |
| 2020-06-09 | 0.25 | 0.34 | 0.43 | 0.66 |
| 2020-06-10 | 0.25 | 0.34 | 0.43 | 0.67 |
| 2020-06-11 | 0.25 | 0.34 | 0.43 | 0.62 |
| 2020-06-12 | 0.25 | 0.34 | 0.43 | 0.62 |
| 2020-06-15 | 0.25 | 0.34 | 0.43 | 0.61 |
| 2020-06-16 | 0.25 | 0.34 | 0.43 | 0.63 |
| 2020-06-17 | 0.25 | 0.34 | 0.43 | 0.66 |
| 2020-06-18 | 0.25 | 0.34 | 0.43 | 0.66 |
| 2020-06-19 | 0.25 | 0.34 | 0.43 | 0.65 |
| 2020-06-22 | 0.25 | 0.34 | 0.43 | 0.65 |
| 2020-06-23 | 0.25 | 0.34 | 0.43 | 0.66 |
| 2020-06-24 | 0.25 | 0.34 | 0.43 | 0.61 |
| 2020-06-25 | 0.25 | 0.34 | 0.43 | 0.59 |
| 2020-06-26 | 0.25 | 0.34 | 0.43 | 0.55 |
| 2020-06-29 | 0.25 | 0.34 | 0.43 | 0.54 |
| 2020-06-30 | 0.25 | 0.34 | 0.43 | 0.51 |
| 2020-07-01 | 0.25 | 0.34 | 0.43 | 0.5 |
| 2020-07-02 | 0.25 | 0.34 | 0.43 | 0.51 |
| 2020-07-03 | 0.25 | 0.34 | 0.43 | 0.51 |
| 2020-07-07 | 0.25 | 0.34 | 0.43 | 0.51 |
| 2020-07-08 | 0.25 | 0.34 | 0.43 | 0.51 |
| 2020-07-09 | 0.25 | 0.34 | 0.43 | 0.51 |
| 2020-07-10 | 0.25 | 0.34 | 0.43 | 0.51 |
| 2020-07-13 | 0.25 | 0.34 | 0.43 | 0.6 |
| 2020-07-14 | 0.25 | 0.34 | 0.43 | 0.59 |
| 2020-07-15 | 0.25 | 0.34 | 0.43 | 0.61 |
| 2020-07-16 | 0.25 | 0.34 | 0.43 | 0.65 |
| 2020-07-17 | 0.25 | 0.34 | 0.43 | 0.68 |
| 2020-07-20 | 0.25 | 0.34 | 0.43 | 0.67 |
| 2020-07-21 | 0.25 | 0.34 | 0.43 | 0.65 |
| 2020-07-22 | 0.25 | 0.34 | 0.43 | 0.65 |
| 2020-07-23 | 0.25 | 0.34 | 0.43 | 0.65 |
| 2020-07-24 | 0.25 | 0.34 | 0.43 | 0.66 |
| 2020-07-27 | 0.25 | 0.34 | 0.43 | 0.67 |
| 2020-07-28 | 0.25 | 0.34 | 0.43 | 0.67 |
| 2020-07-29 | 0.25 | 0.34 | 0.43 | 0.67 |
| 2020-07-30 | 0.25 | 0.34 | 0.43 | 0.67 |
| 2020-07-31 | 0.25 | 0.34 | 0.43 | 0.67 |